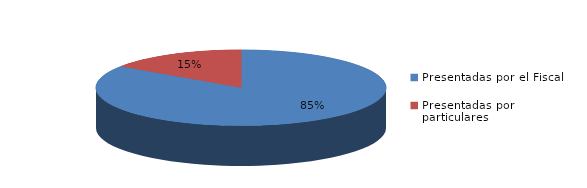
| Category | Series 0 |
|---|---|
| Presentadas por el Fiscal | 186 |
| Presentadas por particulares | 34 |